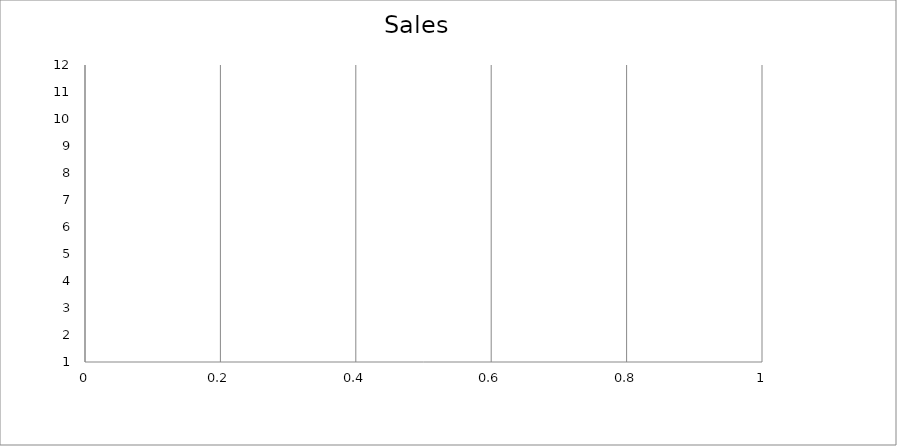
| Category | Actual |
|---|---|
| 0 | 2300 |
| 1 | 3480 |
| 2 | 680 |
| 3 | 3450 |
| 4 | 2650 |
| 5 | 1250 |
| 6 | 3000 |
| 7 | 2080 |
| 8 | 1210 |
| 9 | 770 |
| 10 | 1620 |
| 11 | 1800 |